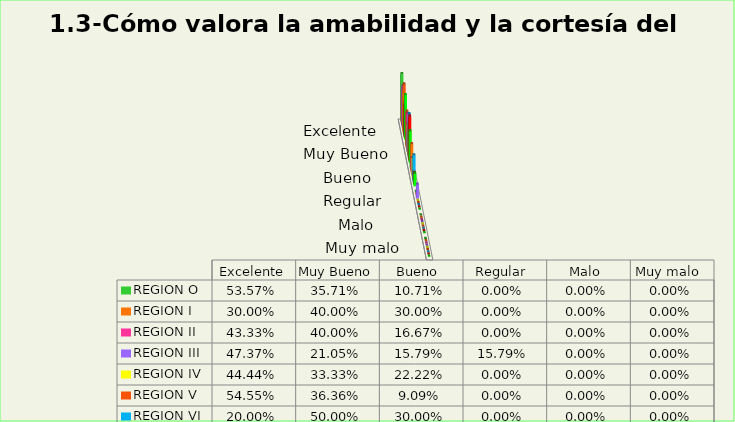
| Category | REGION O | REGION I  | REGION II | REGION III | REGION IV | REGION V  | REGION VI  | REGION VII  | REGION VIII |
|---|---|---|---|---|---|---|---|---|---|
| Excelente | 0.536 | 0.3 | 0.433 | 0.474 | 0.444 | 0.545 | 0.2 | 0.375 | 0.5 |
| Muy Bueno | 0.357 | 0.4 | 0.4 | 0.211 | 0.333 | 0.364 | 0.5 | 0.5 | 0.357 |
| Bueno  | 0.107 | 0.3 | 0.167 | 0.158 | 0.222 | 0.091 | 0.3 | 0.125 | 0.143 |
| Regular  | 0 | 0 | 0 | 0.158 | 0 | 0 | 0 | 0 | 0 |
| Malo  | 0 | 0 | 0 | 0 | 0 | 0 | 0 | 0 | 0 |
| Muy malo  | 0 | 0 | 0 | 0 | 0 | 0 | 0 | 0 | 0 |